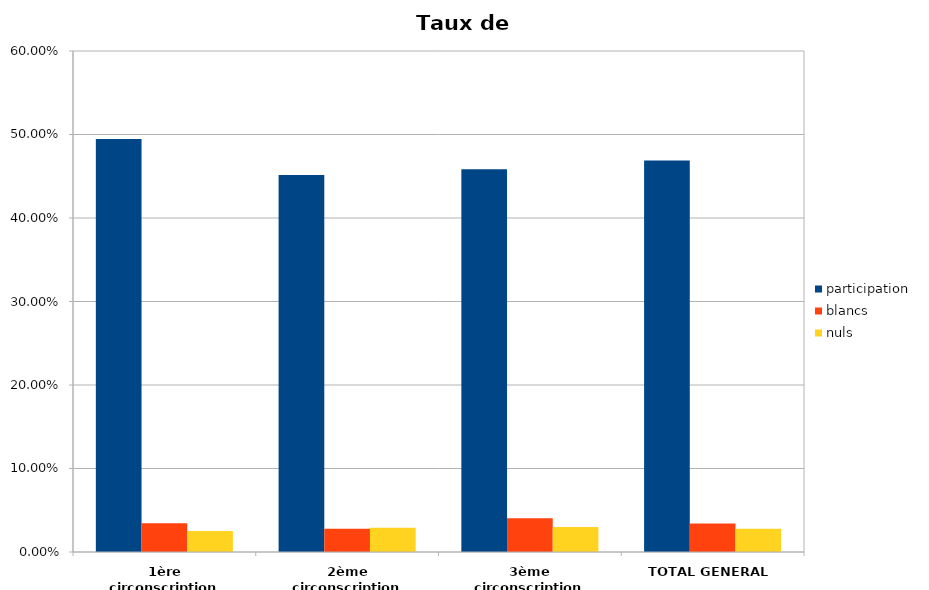
| Category | participation | blancs | nuls |
|---|---|---|---|
| 1ère circonscription | 0.494 | 0.034 | 0.025 |
| 2ème circonscription | 0.451 | 0.028 | 0.029 |
| 3ème circonscription | 0.458 | 0.04 | 0.03 |
| TOTAL GENERAL | 0.469 | 0.034 | 0.028 |